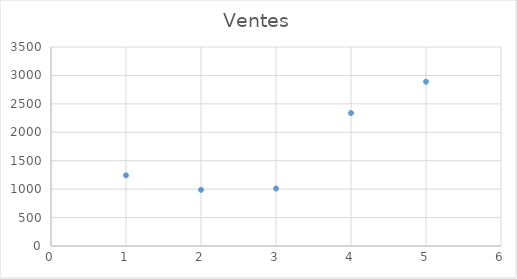
| Category | Ventes |
|---|---|
| 0 | 1243 |
| 1 | 988 |
| 2 | 1012 |
| 3 | 2339 |
| 4 | 2889 |